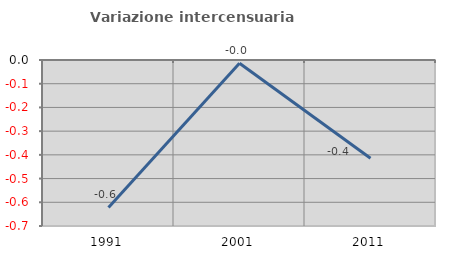
| Category | Variazione intercensuaria annua |
|---|---|
| 1991.0 | -0.622 |
| 2001.0 | -0.014 |
| 2011.0 | -0.414 |